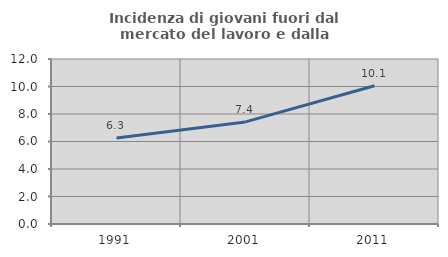
| Category | Incidenza di giovani fuori dal mercato del lavoro e dalla formazione  |
|---|---|
| 1991.0 | 6.25 |
| 2001.0 | 7.424 |
| 2011.0 | 10.056 |